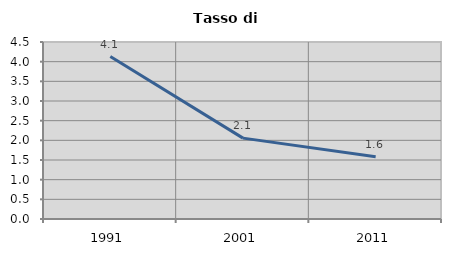
| Category | Tasso di disoccupazione   |
|---|---|
| 1991.0 | 4.129 |
| 2001.0 | 2.056 |
| 2011.0 | 1.583 |